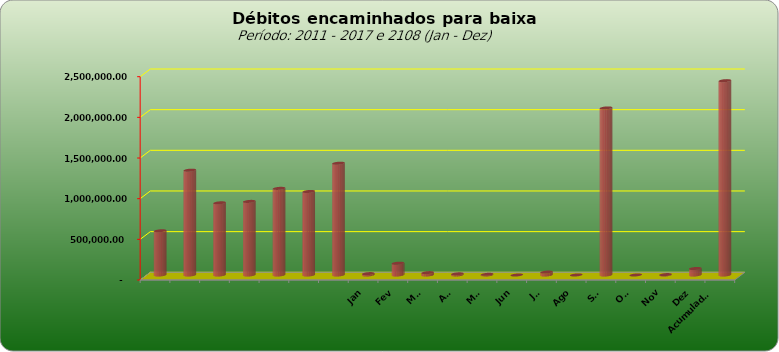
| Category |  543.796,20  |
|---|---|
|  | 543796.2 |
|  | 1289053.69 |
|  | 887573.08 |
|  | 905052.31 |
|  | 1065434.28 |
|  | 1027209.41 |
|  | 1374800.36 |
| Jan | 17005.62 |
| Fev | 145413 |
| Mar | 28943.58 |
| Abr | 13957.8 |
| Mai | 8316.5 |
| Jun | 0 |
| Jul | 35839.29 |
| Ago | 627.19 |
| Set | 2054577.66 |
| Out | 0 |
| Nov | 4803.3 |
| Dez | 80223.15 |
| Acumulado
2016 | 2389707.09 |